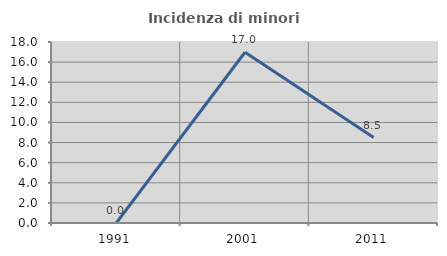
| Category | Incidenza di minori stranieri |
|---|---|
| 1991.0 | 0 |
| 2001.0 | 16.981 |
| 2011.0 | 8.497 |